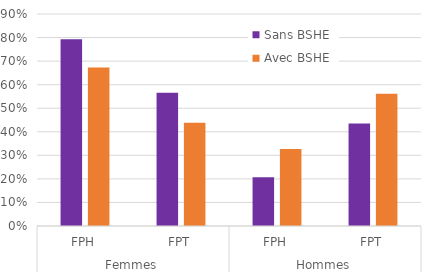
| Category | Sans BSHE | Avec BSHE |
|---|---|---|
| 0 | 0.793 | 0.673 |
| 1 | 0.565 | 0.438 |
| 2 | 0.207 | 0.327 |
| 3 | 0.435 | 0.562 |